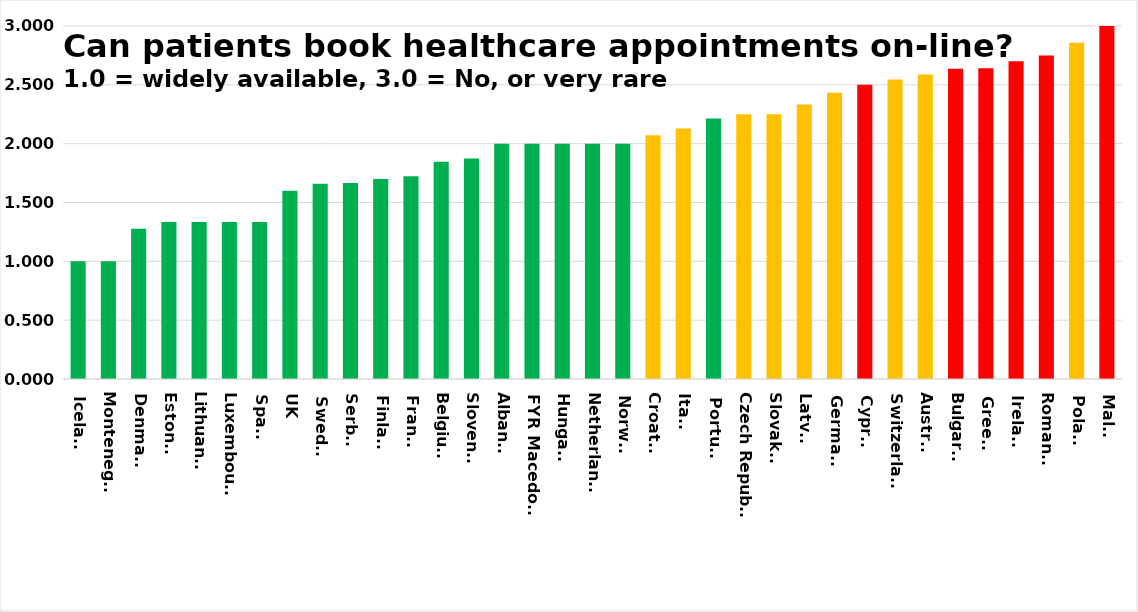
| Category | Series 0 |
|---|---|
| Iceland | 1 |
| Montenegro | 1 |
| Denmark | 1.278 |
| Estonia | 1.333 |
| Lithuania | 1.333 |
| Luxembourg | 1.333 |
| Spain | 1.333 |
| UK | 1.6 |
| Sweden | 1.66 |
| Serbia | 1.667 |
| Finland | 1.7 |
| France | 1.724 |
| Belgium | 1.846 |
| Slovenia | 1.875 |
| Albania | 2 |
| FYR Macedonia | 2 |
| Hungary | 2 |
| Netherlands | 2 |
| Norway | 2 |
| Croatia | 2.071 |
| Italy | 2.129 |
| Portugal | 2.214 |
| Czech Republic | 2.25 |
| Slovakia | 2.25 |
| Latvia | 2.333 |
| Germany | 2.433 |
| Cyprus | 2.5 |
| Switzerland | 2.545 |
| Austria | 2.588 |
| Bulgaria | 2.636 |
| Greece | 2.64 |
| Ireland | 2.7 |
| Romania | 2.75 |
| Poland | 2.857 |
| Malta | 3 |